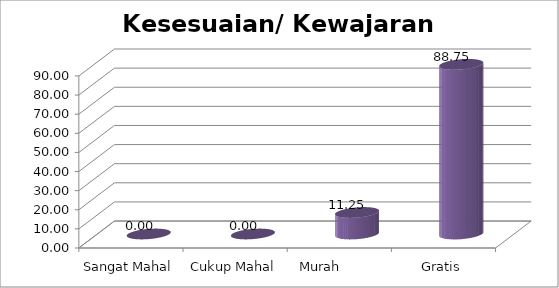
| Category | Kesesuaian/ Kewajaran Biaya |
|---|---|
| Sangat Mahal | 0 |
| Cukup Mahal | 0 |
| Murah         | 11.25 |
| Gratis | 88.75 |